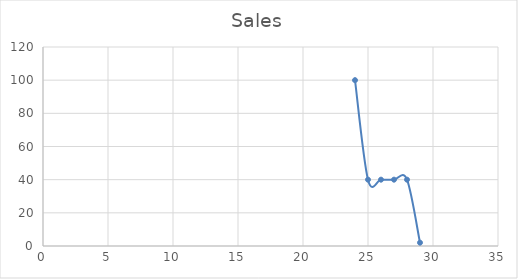
| Category | Sales |
|---|---|
| 24.0 | 100 |
| 25.0 | 40 |
| 26.0 | 40 |
| 27.0 | 40 |
| 28.0 | 40 |
| 29.0 | 2 |